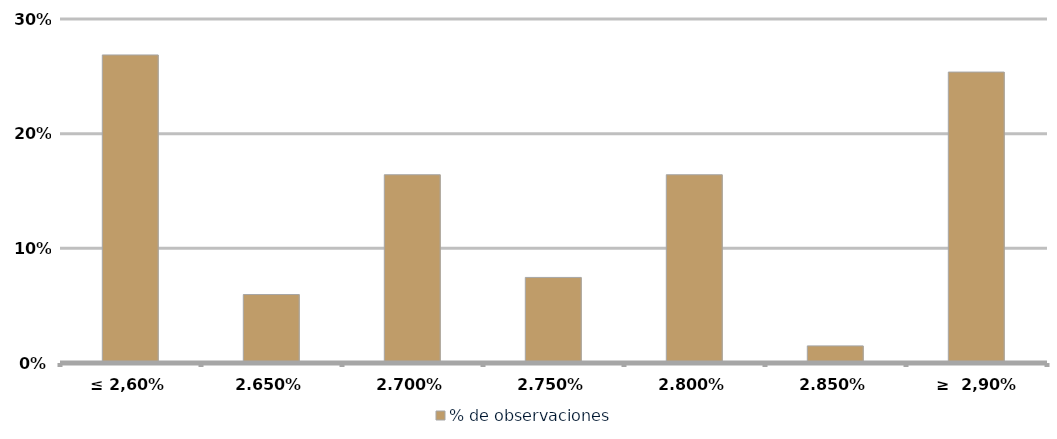
| Category | % de observaciones  |
|---|---|
| ≤ 2,60% | 0.269 |
| 2,65% | 0.06 |
| 2,70% | 0.164 |
| 2,75% | 0.075 |
| 2,80% | 0.164 |
| 2,85% | 0.015 |
| ≥  2,90% | 0.254 |